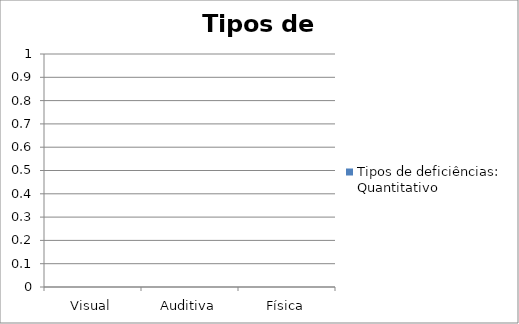
| Category | Tipos de deficiências: Quantitativo |
|---|---|
| Visual | 0 |
| Auditiva | 0 |
| Física | 0 |